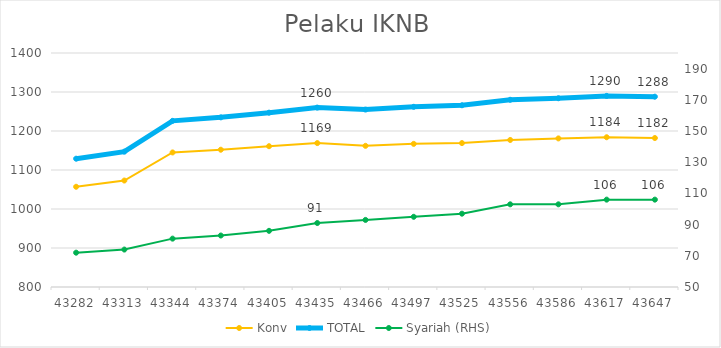
| Category | Konv | TOTAL |
|---|---|---|
| 43282.0 | 1057 | 1129 |
| 43313.0 | 1073 | 1147 |
| 43344.0 | 1145 | 1226 |
| 43374.0 | 1152 | 1235 |
| 43405.0 | 1161 | 1247 |
| 43435.0 | 1169 | 1260 |
| 43466.0 | 1162 | 1255 |
| 43497.0 | 1167 | 1262 |
| 43525.0 | 1169 | 1266 |
| 43556.0 | 1177 | 1280 |
| 43586.0 | 1181 | 1284 |
| 43617.0 | 1184 | 1290 |
| 43647.0 | 1182 | 1288 |